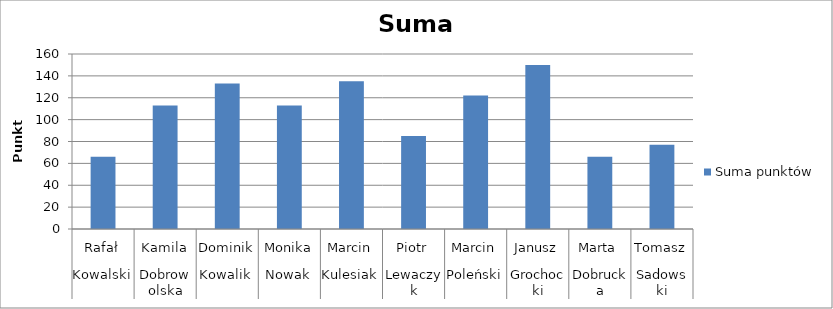
| Category | Suma punktów |
|---|---|
| 0 | 66 |
| 1 | 113 |
| 2 | 133 |
| 3 | 113 |
| 4 | 135 |
| 5 | 85 |
| 6 | 122 |
| 7 | 150 |
| 8 | 66 |
| 9 | 77 |